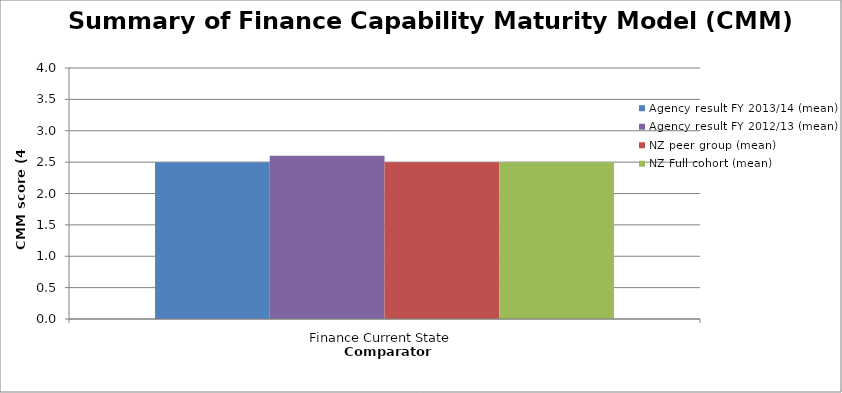
| Category | Agency result FY 2013/14 (mean) | Agency result FY 2012/13 (mean) | NZ peer group (mean) | NZ Full cohort (mean) |
|---|---|---|---|---|
| Finance Current State | 2.5 | 2.6 | 2.5 | 2.5 |